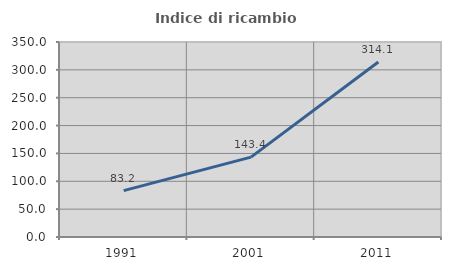
| Category | Indice di ricambio occupazionale  |
|---|---|
| 1991.0 | 83.172 |
| 2001.0 | 143.44 |
| 2011.0 | 314.118 |